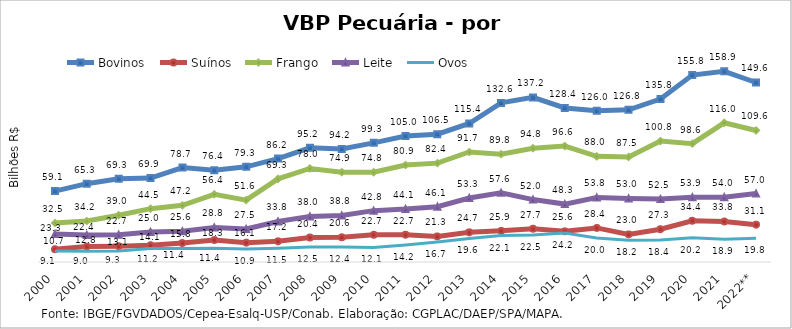
| Category | Bovinos | Suínos | Frango | Leite | Ovos |
|---|---|---|---|---|---|
| 2000 | 59.063 | 10.694 | 32.5 | 23.329 | 9.122 |
| 2001 | 65.289 | 12.83 | 34.16 | 22.449 | 8.989 |
| 2002 | 69.283 | 13.15 | 38.992 | 22.732 | 9.261 |
| 2003 | 69.925 | 14.054 | 44.454 | 25.033 | 11.202 |
| 2004 | 78.674 | 15.801 | 47.204 | 25.584 | 11.353 |
| 2005 | 76.381 | 18.32 | 56.436 | 28.775 | 11.43 |
| 2006 | 79.302 | 16.115 | 51.557 | 27.485 | 10.858 |
| 2007 | 86.183 | 17.232 | 69.272 | 33.789 | 11.54 |
| 2008 | 95.157 | 20.404 | 77.977 | 38.011 | 12.462 |
| 2009 | 94.164 | 20.625 | 74.869 | 38.752 | 12.426 |
| 2010 | 99.277 | 22.69 | 74.779 | 42.797 | 12.086 |
| 2011 | 104.952 | 22.726 | 80.877 | 44.118 | 14.241 |
| 2012 | 106.516 | 21.338 | 82.386 | 46.102 | 16.694 |
| 2013 | 115.426 | 24.706 | 91.697 | 53.349 | 19.634 |
| 2014 | 132.603 | 25.95 | 89.842 | 57.61 | 22.06 |
| 2015 | 137.167 | 27.732 | 94.846 | 52.003 | 22.461 |
| 2016 | 128.395 | 25.593 | 96.641 | 48.253 | 24.215 |
| 2017 | 125.997 | 28.411 | 88.023 | 53.763 | 19.96 |
| 2018 | 126.841 | 23.008 | 87.544 | 52.964 | 18.15 |
| 2019 | 135.819 | 27.348 | 100.797 | 52.473 | 18.381 |
| 2020 | 155.793 | 34.376 | 98.617 | 53.95 | 20.186 |
| 2021 | 158.868 | 33.764 | 116.012 | 54.009 | 18.917 |
| 2022** | 149.585 | 31.096 | 109.629 | 57.014 | 19.84 |